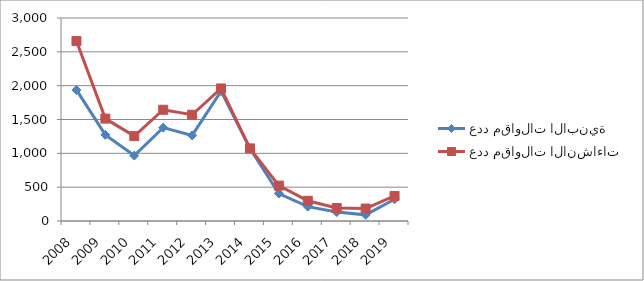
| Category | عدد مقاولات الابنية  | عدد مقاولات الانشاءات  |
|---|---|---|
| 2008.0 | 1937 | 2659 |
| 2009.0 | 1273 | 1513 |
| 2010.0 | 967 | 1255 |
| 2011.0 | 1380 | 1644 |
| 2012.0 | 1265 | 1570 |
| 2013.0 | 1919 | 1959 |
| 2014.0 | 1073 | 1073 |
| 2015.0 | 406 | 523 |
| 2016.0 | 212 | 299 |
| 2017.0 | 132 | 191 |
| 2018.0 | 91 | 184 |
| 2019.0 | 321 | 370 |